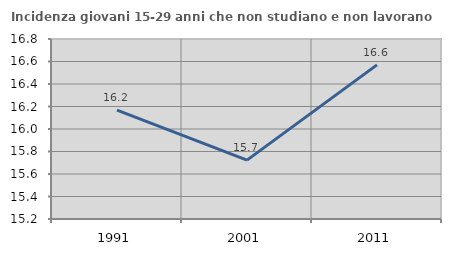
| Category | Incidenza giovani 15-29 anni che non studiano e non lavorano  |
|---|---|
| 1991.0 | 16.168 |
| 2001.0 | 15.723 |
| 2011.0 | 16.57 |